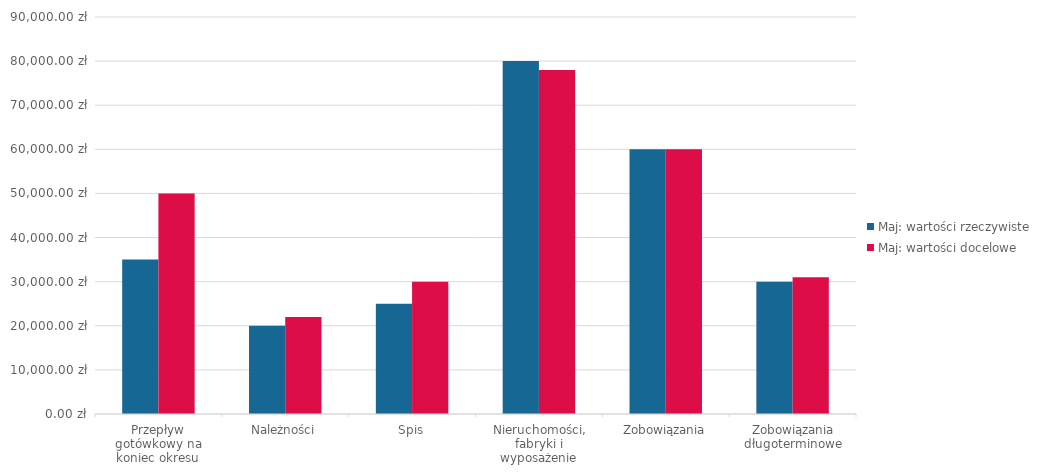
| Category | Maj: wartości rzeczywiste | Maj: wartości docelowe |
|---|---|---|
| Przepływ gotówkowy na koniec okresu | 35000 | 50000 |
| Należności | 20000 | 22000 |
| Spis | 25000 | 30000 |
| Nieruchomości, fabryki i wyposażenie | 80000 | 78000 |
| Zobowiązania | 60000 | 60000 |
| Zobowiązania długoterminowe | 30000 | 31000 |